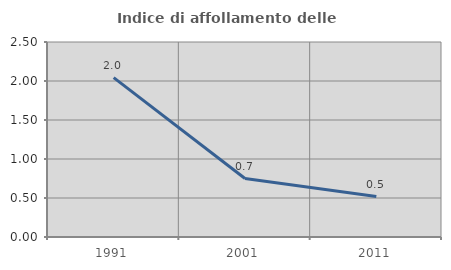
| Category | Indice di affollamento delle abitazioni  |
|---|---|
| 1991.0 | 2.043 |
| 2001.0 | 0.749 |
| 2011.0 | 0.518 |